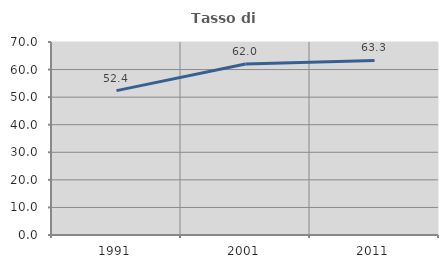
| Category | Tasso di occupazione   |
|---|---|
| 1991.0 | 52.374 |
| 2001.0 | 62.002 |
| 2011.0 | 63.328 |